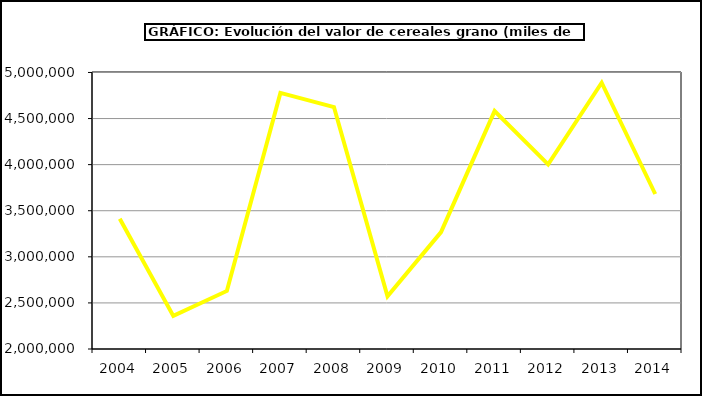
| Category | Valor |
|---|---|
| 2004.0 | 3412054.026 |
| 2005.0 | 2359343.727 |
| 2006.0 | 2629835.116 |
| 2007.0 | 4777990.344 |
| 2008.0 | 4625039.537 |
| 2009.0 | 2572134.163 |
| 2010.0 | 3268396.026 |
| 2011.0 | 4580902.717 |
| 2012.0 | 4003467.41 |
| 2013.0 | 4888762 |
| 2014.0 | 3681432.099 |